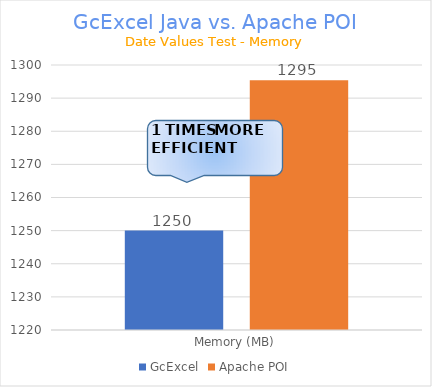
| Category | GcExcel | Apache POI |
|---|---|---|
| Memory (MB) | 1250.036 | 1295.389 |